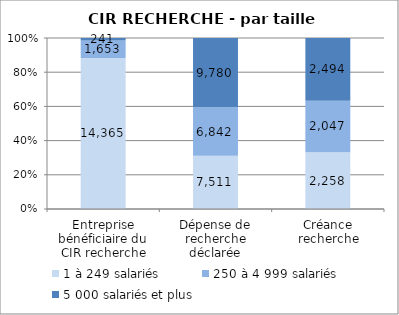
| Category | 1 à 249 salariés | 250 à 4 999 salariés | 5 000 salariés et plus |
|---|---|---|---|
| Entreprise bénéficiaire du CIR recherche | 14365 | 1653 | 241 |
| Dépense de recherche déclarée | 7511.28 | 6841.6 | 9780.19 |
| Créance recherche | 2257.72 | 2046.5 | 2494.42 |